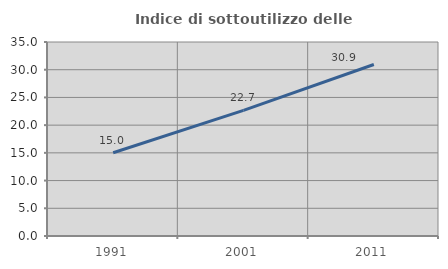
| Category | Indice di sottoutilizzo delle abitazioni  |
|---|---|
| 1991.0 | 15.014 |
| 2001.0 | 22.652 |
| 2011.0 | 30.937 |